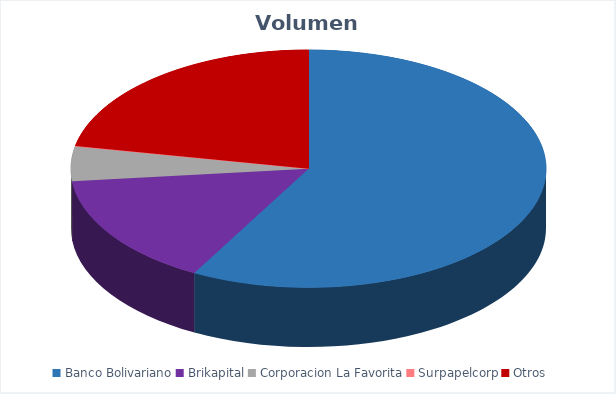
| Category | VOLUMEN ($USD) |
|---|---|
| Banco Bolivariano | 132150 |
| Brikapital | 35000 |
| Corporacion La Favorita | 10669.99 |
| Surpapelcorp | 170 |
| Otros | 50000 |